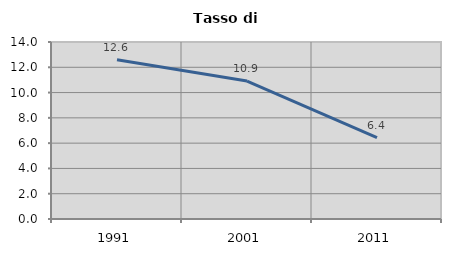
| Category | Tasso di disoccupazione   |
|---|---|
| 1991.0 | 12.603 |
| 2001.0 | 10.914 |
| 2011.0 | 6.434 |